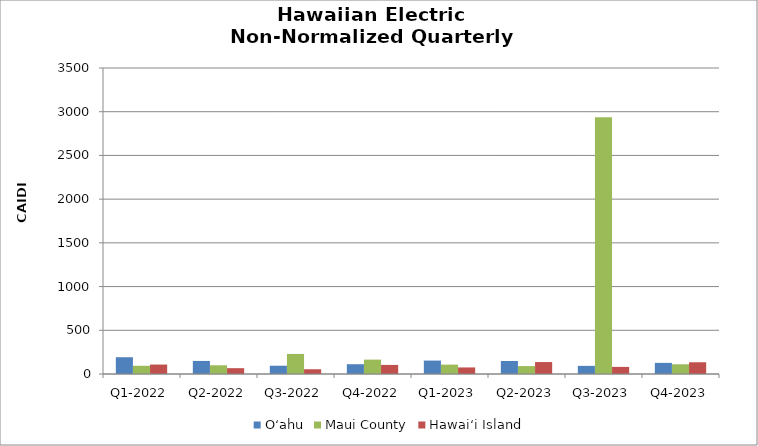
| Category | O‘ahu | Maui County | Hawai‘i Island |
|---|---|---|---|
| Q1-2022 | 191.91 | 94.192 | 107.909 |
| Q2-2022 | 149.443 | 99.738 | 66.604 |
| Q3-2022 | 94.719 | 229.281 | 54.39 |
| Q4-2022 | 111.911 | 164.498 | 103.889 |
| Q1-2023 | 153.546 | 107.155 | 75.031 |
| Q2-2023 | 148.815 | 90.562 | 136.569 |
| Q3-2023 | 92.967 | 2937.664 | 81.242 |
| Q4-2023 | 127.113 | 111.28 | 134.16 |